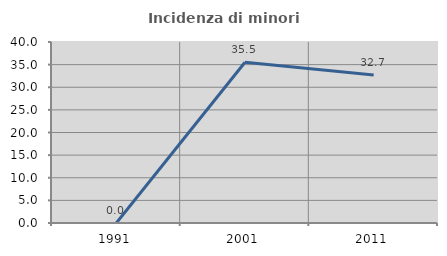
| Category | Incidenza di minori stranieri |
|---|---|
| 1991.0 | 0 |
| 2001.0 | 35.514 |
| 2011.0 | 32.686 |